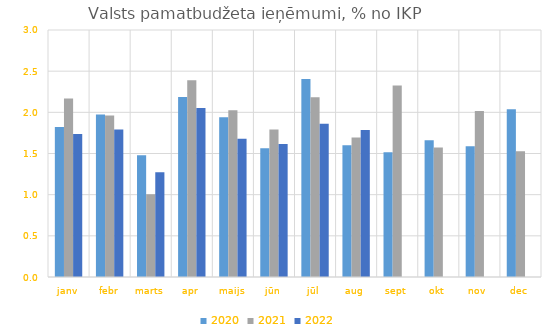
| Category | 2020 | 2021 | 2022 |
|---|---|---|---|
| janv | 1.822 | 2.169 | 1.738 |
| febr | 1.972 | 1.962 | 1.793 |
| marts | 1.478 | 1.005 | 1.271 |
| apr | 2.186 | 2.391 | 2.052 |
| maijs | 1.941 | 2.024 | 1.679 |
| jūn | 1.564 | 1.793 | 1.617 |
| jūl | 2.406 | 2.183 | 1.861 |
| aug | 1.601 | 1.695 | 1.786 |
| sept | 1.514 | 2.326 | 0 |
| okt | 1.662 | 1.573 | 0 |
| nov | 1.588 | 2.016 | 0 |
| dec | 2.038 | 1.529 | 0 |